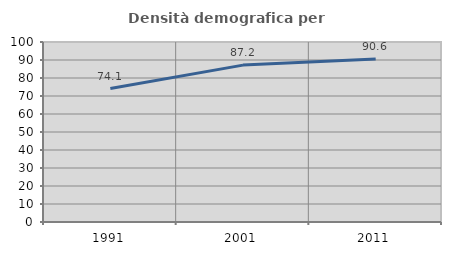
| Category | Densità demografica |
|---|---|
| 1991.0 | 74.146 |
| 2001.0 | 87.154 |
| 2011.0 | 90.623 |